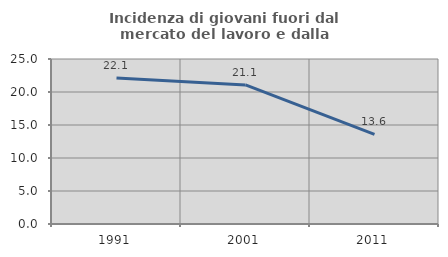
| Category | Incidenza di giovani fuori dal mercato del lavoro e dalla formazione  |
|---|---|
| 1991.0 | 22.117 |
| 2001.0 | 21.074 |
| 2011.0 | 13.58 |